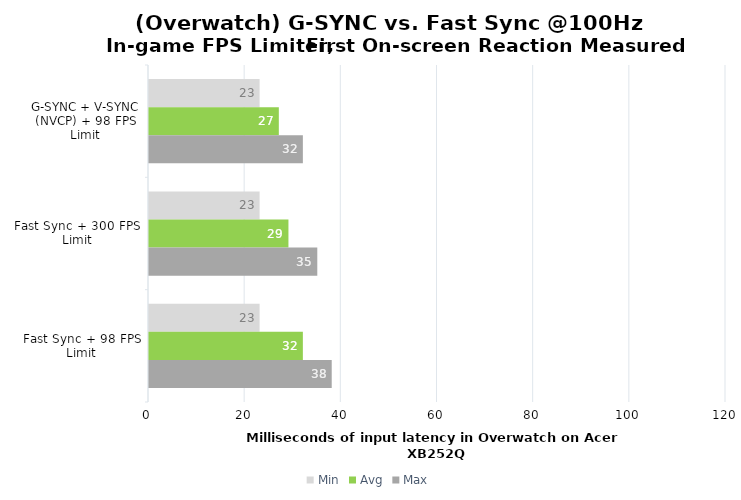
| Category | Min | Avg | Max |
|---|---|---|---|
| G-SYNC + V-SYNC (NVCP) + 98 FPS Limit | 23 | 27 | 32 |
| Fast Sync + 300 FPS Limit | 23 | 29 | 35 |
| Fast Sync + 98 FPS Limit | 23 | 32 | 38 |